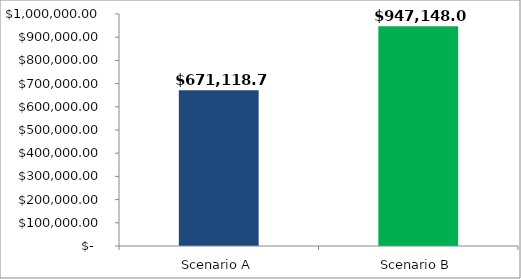
| Category | Cumulative Retirement Income: |
|---|---|
| Scenario A | 671118.763 |
| Scenario B | 947148.054 |